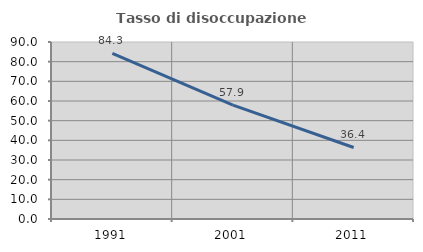
| Category | Tasso di disoccupazione giovanile  |
|---|---|
| 1991.0 | 84.266 |
| 2001.0 | 57.895 |
| 2011.0 | 36.364 |